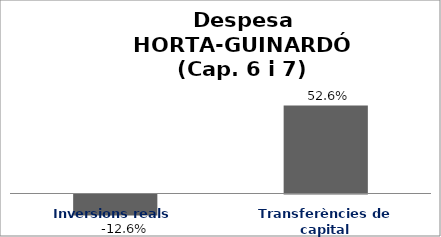
| Category | Series 0 |
|---|---|
| Inversions reals | -0.126 |
| Transferències de capital | 0.526 |